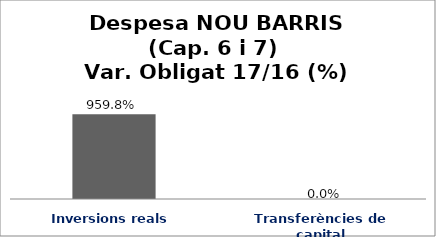
| Category | Series 0 |
|---|---|
| Inversions reals | 9.598 |
| Transferències de capital | 0 |